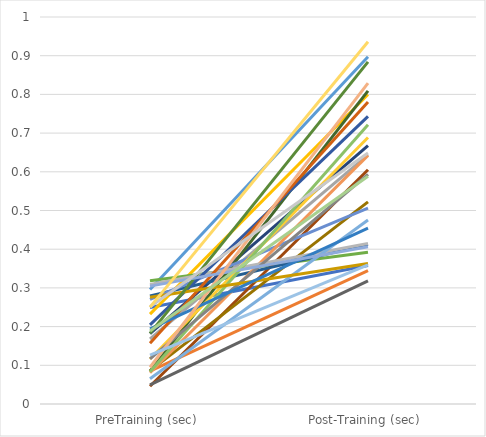
| Category | Series 0 | Series 1 | Series 2 | Series 3 | Series 4 | Series 5 | Series 6 | Series 7 | Series 8 | Series 9 | Series 10 | Series 11 | Series 12 | Series 13 | Series 14 | Series 15 | Series 16 | Series 17 | Series 18 | Series 19 | Series 20 | Series 21 | Series 22 | Series 23 | Series 24 | Series 25 | Series 26 | Series 27 | Series 28 | Series 29 |
|---|---|---|---|---|---|---|---|---|---|---|---|---|---|---|---|---|---|---|---|---|---|---|---|---|---|---|---|---|---|---|
| PreTraining (sec) | 0.25 | 0.085 | 0.168 | 0.232 | 0.296 | 0.319 | 0.182 | 0.046 | 0.05 | 0.086 | 0.279 | 0.084 | 0.27 | 0.081 | 0.309 | 0.116 | 0.065 | 0.083 | 0.205 | 0.157 | 0.117 | 0.276 | 0.194 | 0.183 | 0.305 | 0.095 | 0.252 | 0.25 | 0.126 | 0.189 |
| Post-Training (sec) | 0.358 | 0.344 | 0.644 | 0.8 | 0.897 | 0.392 | 0.668 | 0.605 | 0.318 | 0.522 | 0.412 | 0.809 | 0.506 | 0.642 | 0.414 | 0.688 | 0.476 | 0.721 | 0.743 | 0.78 | 0.593 | 0.363 | 0.454 | 0.884 | 0.406 | 0.829 | 0.649 | 0.936 | 0.36 | 0.588 |